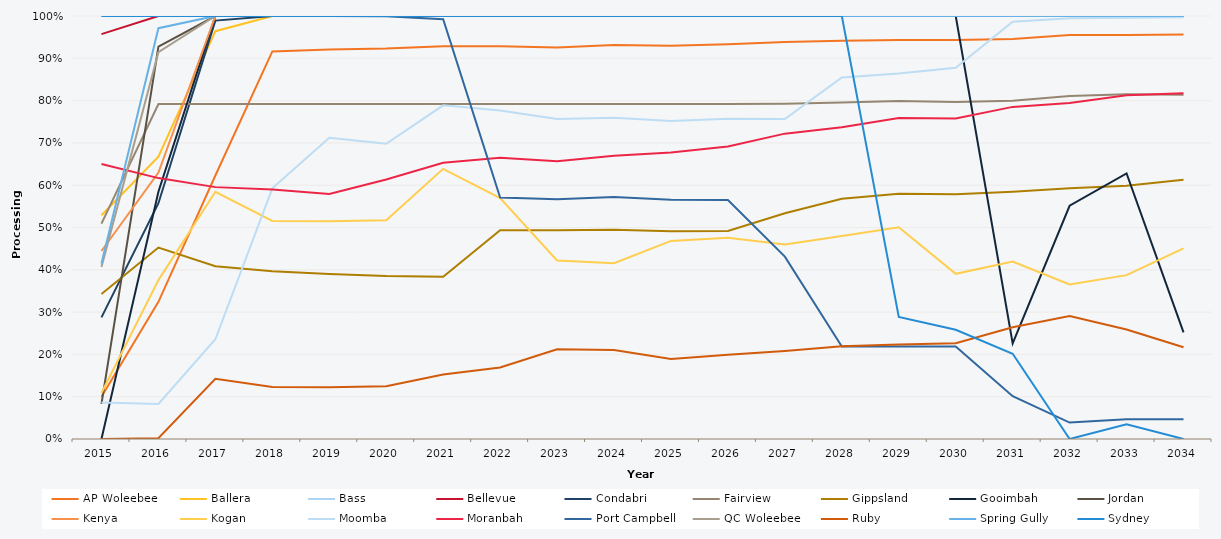
| Category | AP Woleebee | Ballera | Bass | Bellevue | Condabri | Fairview | Gippsland | Gooimbah | Jordan | Kenya | Kogan | Moomba | Moranbah | Port Campbell | QC Woleebee | Ruby | Spring Gully | Sydney |
|---|---|---|---|---|---|---|---|---|---|---|---|---|---|---|---|---|---|---|
| 2015.0 | 0.1 | 0.529 | 1 | 0.957 | 0.288 | 0.509 | 0.343 | 0 | 0.083 | 0.444 | 0.109 | 0.087 | 0.65 | 1.496 | 0.407 | 0 | 0.415 | 1 |
| 2016.0 | 0.324 | 0.668 | 1 | 1 | 0.557 | 0.792 | 0.452 | 0.585 | 0.927 | 0.63 | 0.376 | 0.083 | 0.617 | 1 | 0.915 | 0.002 | 0.971 | 1 |
| 2017.0 | 0.623 | 0.964 | 1 | 1 | 0.989 | 0.792 | 0.408 | 1 | 1 | 1 | 0.584 | 0.236 | 0.595 | 1 | 1 | 0.142 | 1 | 1 |
| 2018.0 | 0.916 | 1 | 1 | 1 | 1 | 0.792 | 0.396 | 1 | 1 | 1 | 0.516 | 0.593 | 0.59 | 1 | 1 | 0.123 | 1 | 1 |
| 2019.0 | 0.921 | 1 | 1 | 1 | 1 | 0.792 | 0.39 | 1 | 1 | 1 | 0.515 | 0.712 | 0.579 | 1 | 1 | 0.123 | 1 | 1 |
| 2020.0 | 0.923 | 1 | 1 | 1 | 1 | 0.792 | 0.385 | 1 | 1 | 1 | 0.517 | 0.698 | 0.614 | 1 | 1 | 0.125 | 1 | 1 |
| 2021.0 | 0.929 | 1 | 1 | 1 | 1 | 0.792 | 0.384 | 1 | 1 | 1 | 0.639 | 0.789 | 0.653 | 0.992 | 1 | 0.152 | 1 | 1 |
| 2022.0 | 0.928 | 1 | 1 | 1 | 1 | 0.792 | 0.493 | 1 | 1 | 1 | 0.57 | 0.777 | 0.665 | 0.571 | 1 | 0.169 | 1 | 1 |
| 2023.0 | 0.926 | 1 | 1 | 1 | 1 | 0.792 | 0.493 | 1 | 1 | 1 | 0.422 | 0.757 | 0.657 | 0.567 | 1 | 0.212 | 1 | 1 |
| 2024.0 | 0.931 | 1 | 1 | 1 | 1 | 0.792 | 0.495 | 1 | 1 | 1 | 0.416 | 0.759 | 0.669 | 0.572 | 1 | 0.21 | 1 | 1 |
| 2025.0 | 0.93 | 1 | 1 | 1 | 1 | 0.792 | 0.491 | 1 | 1 | 1 | 0.468 | 0.752 | 0.677 | 0.566 | 1 | 0.189 | 1 | 1 |
| 2026.0 | 0.933 | 1 | 1 | 1 | 1 | 0.792 | 0.492 | 1 | 1 | 1 | 0.476 | 0.757 | 0.691 | 0.565 | 1 | 0.199 | 1 | 1 |
| 2027.0 | 0.939 | 1 | 1 | 1 | 1 | 0.792 | 0.534 | 1 | 1 | 1 | 0.46 | 0.757 | 0.722 | 0.431 | 1 | 0.208 | 1 | 1 |
| 2028.0 | 0.941 | 1 | 1 | 1 | 1 | 0.795 | 0.568 | 1 | 1 | 1 | 0.48 | 0.855 | 0.737 | 0.219 | 1 | 0.219 | 1 | 1 |
| 2029.0 | 0.943 | 1 | 1 | 1 | 1 | 0.799 | 0.58 | 1 | 1 | 1 | 0.5 | 0.864 | 0.759 | 0.219 | 1 | 0.223 | 1 | 0.289 |
| 2030.0 | 0.943 | 1 | 1 | 1 | 1 | 0.796 | 0.579 | 1 | 1 | 1 | 0.39 | 0.878 | 0.758 | 0.219 | 1 | 0.227 | 1 | 0.258 |
| 2031.0 | 0.946 | 1 | 1 | 1 | 1 | 0.8 | 0.584 | 0.226 | 1 | 1 | 0.42 | 0.986 | 0.785 | 0.101 | 1 | 0.264 | 1 | 0.202 |
| 2032.0 | 0.955 | 1 | 1 | 1 | 1 | 0.811 | 0.593 | 0.551 | 1 | 1 | 0.365 | 0.994 | 0.794 | 0.039 | 1 | 0.291 | 1 | 0 |
| 2033.0 | 0.955 | 1 | 1 | 1 | 1 | 0.815 | 0.599 | 0.628 | 1 | 1 | 0.387 | 0.996 | 0.812 | 0.047 | 1 | 0.259 | 1 | 0.035 |
| 2034.0 | 0.956 | 1 | 1 | 1 | 1 | 0.814 | 0.613 | 0.252 | 1 | 1 | 0.451 | 0.997 | 0.818 | 0.046 | 1 | 0.217 | 1 | 0 |